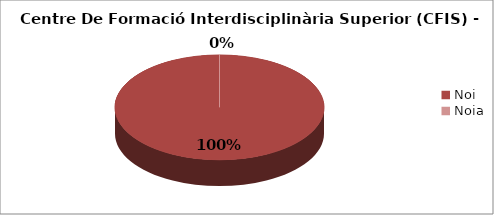
| Category | Centre De Formació Interdisciplinària Superior (CFIS) - Gènere |
|---|---|
| Noi | 1 |
| Noia | 0 |